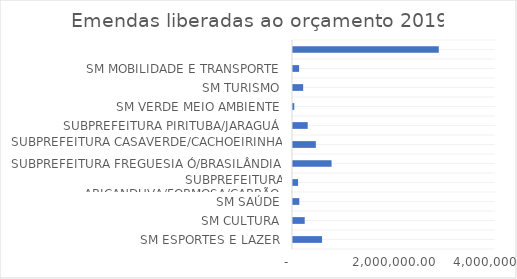
| Category | Series 0 |
|---|---|
| SM ESPORTES E LAZER | 572727 |
| SM CULTURA | 230700 |
| SM SAÚDE | 124300 |
| SUBPREFEITURA ARICANDUVA/FORMOSA/CARRÃO | 100000 |
| SUBPREFEITURA FREGUESIA Ó/BRASILÂNDIA | 760000 |
| SUBPREFEITURA CASAVERDE/CACHOEIRINHA | 450000 |
| SUBPREFEITURA PIRITUBA/JARAGUÁ | 290000 |
| SM VERDE MEIO AMBIENTE | 25000 |
| SM TURISMO | 200000 |
| SM MOBILIDADE E TRANSPORTE | 120000 |